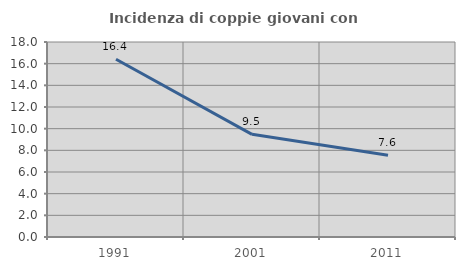
| Category | Incidenza di coppie giovani con figli |
|---|---|
| 1991.0 | 16.41 |
| 2001.0 | 9.478 |
| 2011.0 | 7.555 |